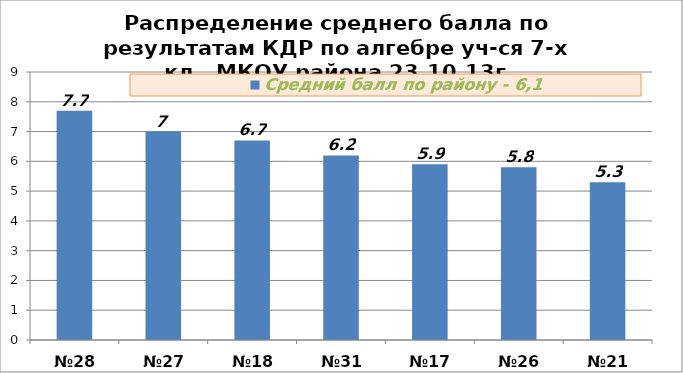
| Category | Средний балл по району - 6,1 |
|---|---|
| №28 | 7.7 |
| №27 | 7 |
| №18 | 6.7 |
| №31 | 6.2 |
| №17 | 5.9 |
| №26 | 5.8 |
| №21 | 5.3 |